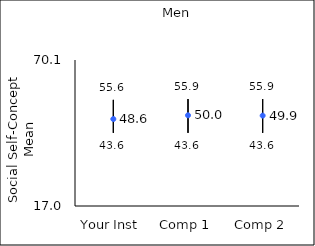
| Category | 25th percentile | 75th percentile | Mean |
|---|---|---|---|
| Your Inst | 43.6 | 55.6 | 48.63 |
| Comp 1 | 43.6 | 55.9 | 49.99 |
| Comp 2 | 43.6 | 55.9 | 49.87 |